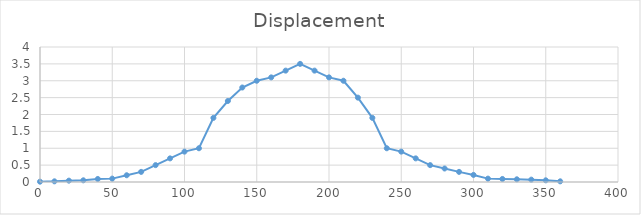
| Category | Series 0 |
|---|---|
| 0.0 | 0.01 |
| 10.0 | 0.02 |
| 20.0 | 0.04 |
| 30.0 | 0.05 |
| 40.0 | 0.09 |
| 50.0 | 0.1 |
| 60.0 | 0.2 |
| 70.0 | 0.3 |
| 80.0 | 0.5 |
| 90.0 | 0.7 |
| 100.0 | 0.9 |
| 110.0 | 1 |
| 120.0 | 1.9 |
| 130.0 | 2.4 |
| 140.0 | 2.8 |
| 150.0 | 3 |
| 160.0 | 3.1 |
| 170.0 | 3.3 |
| 180.0 | 3.5 |
| 190.0 | 3.3 |
| 200.0 | 3.1 |
| 210.0 | 3 |
| 220.0 | 2.5 |
| 230.0 | 1.9 |
| 240.0 | 1 |
| 250.0 | 0.9 |
| 260.0 | 0.7 |
| 270.0 | 0.5 |
| 280.0 | 0.4 |
| 290.0 | 0.3 |
| 300.0 | 0.21 |
| 310.0 | 0.1 |
| 320.0 | 0.09 |
| 330.0 | 0.08 |
| 340.0 | 0.07 |
| 350.0 | 0.05 |
| 360.0 | 0.02 |